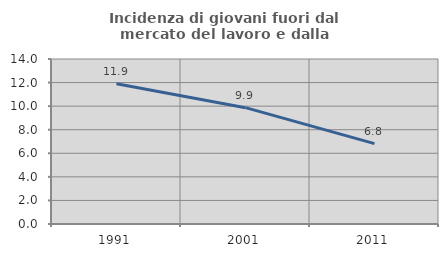
| Category | Incidenza di giovani fuori dal mercato del lavoro e dalla formazione  |
|---|---|
| 1991.0 | 11.897 |
| 2001.0 | 9.871 |
| 2011.0 | 6.818 |